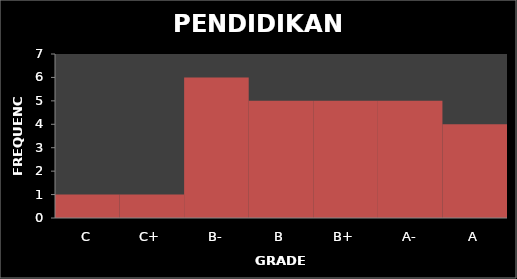
| Category | Series 0 |
|---|---|
| C | 1 |
| C+ | 1 |
| B- | 6 |
| B | 5 |
| B+ | 5 |
| A- | 5 |
| A | 4 |